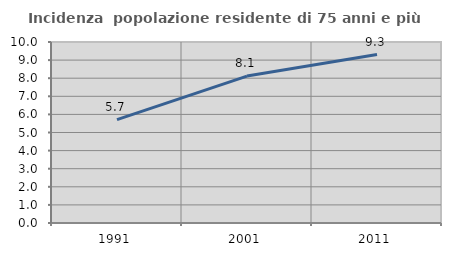
| Category | Incidenza  popolazione residente di 75 anni e più |
|---|---|
| 1991.0 | 5.71 |
| 2001.0 | 8.116 |
| 2011.0 | 9.304 |